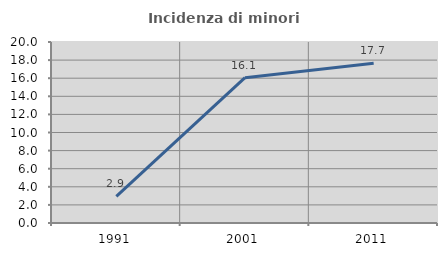
| Category | Incidenza di minori stranieri |
|---|---|
| 1991.0 | 2.941 |
| 2001.0 | 16.058 |
| 2011.0 | 17.665 |